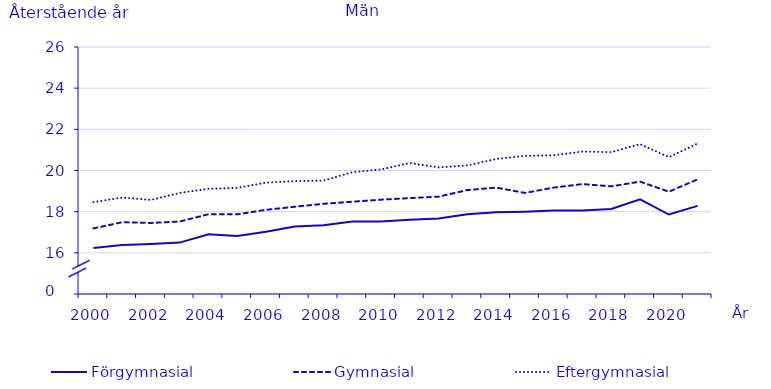
| Category | Förgymnasial | Gymnasial | Eftergymnasial |
|---|---|---|---|
| 2000.0 | 16.235 | 17.187 | 18.462 |
| 2001.0 | 16.382 | 17.487 | 18.686 |
| 2002.0 | 16.431 | 17.452 | 18.571 |
| 2003.0 | 16.497 | 17.521 | 18.91 |
| 2004.0 | 16.902 | 17.875 | 19.111 |
| 2005.0 | 16.817 | 17.87 | 19.157 |
| 2006.0 | 17.022 | 18.089 | 19.41 |
| 2007.0 | 17.28 | 18.24 | 19.485 |
| 2008.0 | 17.342 | 18.382 | 19.509 |
| 2009.0 | 17.518 | 18.483 | 19.918 |
| 2010.0 | 17.52 | 18.583 | 20.052 |
| 2011.0 | 17.607 | 18.659 | 20.362 |
| 2012.0 | 17.67 | 18.73 | 20.15 |
| 2013.0 | 17.88 | 19.05 | 20.25 |
| 2014.0 | 17.97 | 19.17 | 20.56 |
| 2015.0 | 18 | 18.91 | 20.71 |
| 2016.0 | 18.06 | 19.17 | 20.74 |
| 2017.0 | 18.06 | 19.34 | 20.92 |
| 2018.0 | 18.13 | 19.23 | 20.89 |
| 2019.0 | 18.6 | 19.46 | 21.28 |
| 2020.0 | 17.86 | 18.97 | 20.65 |
| 2021.0 | 18.28 | 19.57 | 21.31 |